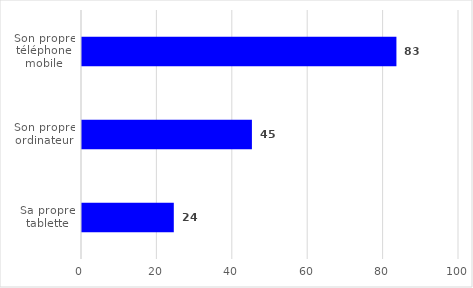
| Category | Series 0 |
|---|---|
| Son propre téléphone mobile | 83.4 |
| Son propre ordinateur | 45.07 |
| Sa propre tablette | 24.35 |